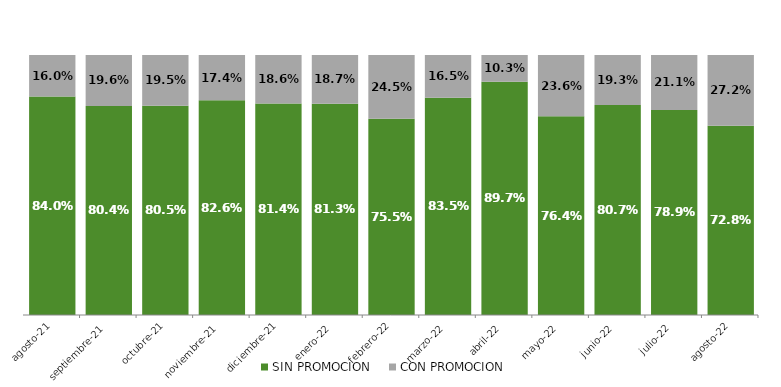
| Category | SIN PROMOCION   | CON PROMOCION   |
|---|---|---|
| 2021-08-01 | 0.84 | 0.16 |
| 2021-09-01 | 0.804 | 0.196 |
| 2021-10-01 | 0.805 | 0.195 |
| 2021-11-01 | 0.826 | 0.174 |
| 2021-12-01 | 0.814 | 0.186 |
| 2022-01-01 | 0.813 | 0.187 |
| 2022-02-01 | 0.755 | 0.245 |
| 2022-03-01 | 0.835 | 0.165 |
| 2022-04-01 | 0.897 | 0.103 |
| 2022-05-01 | 0.764 | 0.236 |
| 2022-06-01 | 0.807 | 0.193 |
| 2022-07-01 | 0.789 | 0.211 |
| 2022-08-01 | 0.728 | 0.272 |